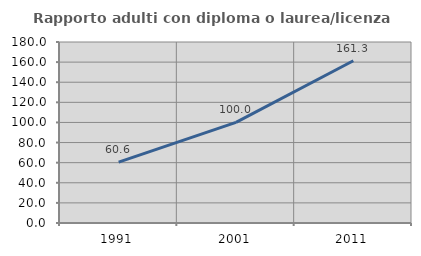
| Category | Rapporto adulti con diploma o laurea/licenza media  |
|---|---|
| 1991.0 | 60.606 |
| 2001.0 | 100 |
| 2011.0 | 161.321 |